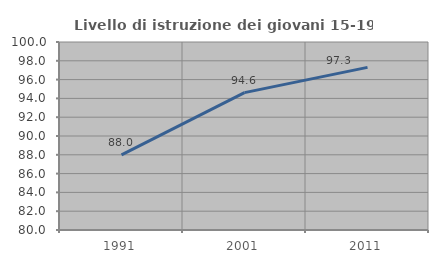
| Category | Livello di istruzione dei giovani 15-19 anni |
|---|---|
| 1991.0 | 87.983 |
| 2001.0 | 94.615 |
| 2011.0 | 97.297 |